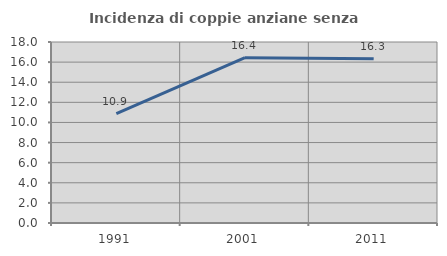
| Category | Incidenza di coppie anziane senza figli  |
|---|---|
| 1991.0 | 10.879 |
| 2001.0 | 16.441 |
| 2011.0 | 16.33 |